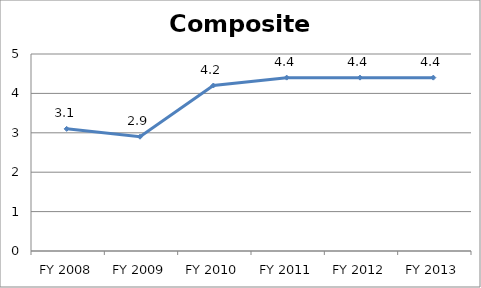
| Category | Composite score |
|---|---|
| FY 2013 | 4.4 |
| FY 2012 | 4.4 |
| FY 2011 | 4.4 |
| FY 2010 | 4.2 |
| FY 2009 | 2.9 |
| FY 2008 | 3.1 |